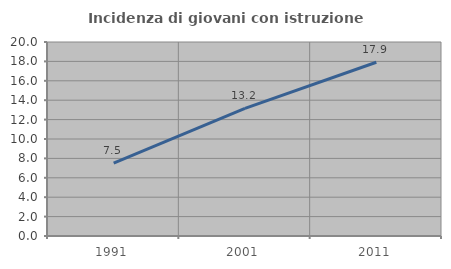
| Category | Incidenza di giovani con istruzione universitaria |
|---|---|
| 1991.0 | 7.51 |
| 2001.0 | 13.158 |
| 2011.0 | 17.91 |